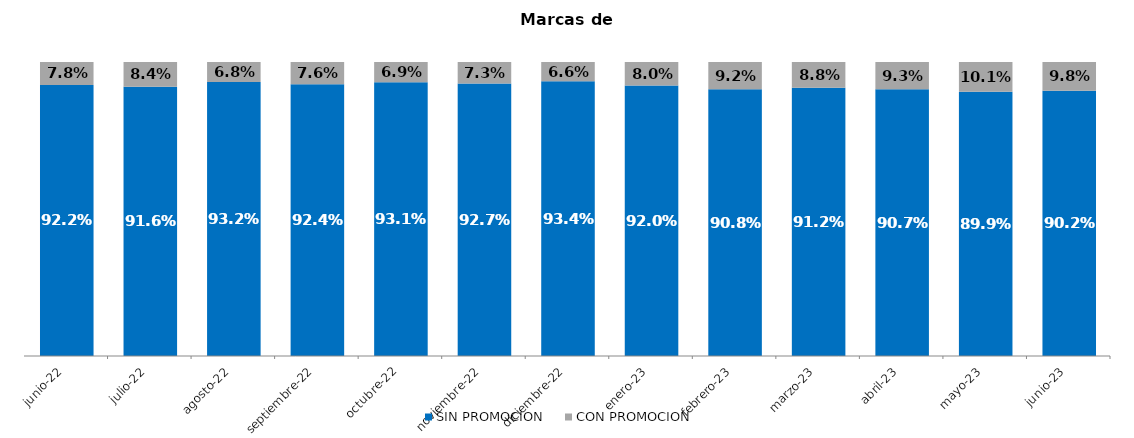
| Category | SIN PROMOCION   | CON PROMOCION   |
|---|---|---|
| 2022-06-01 | 0.922 | 0.078 |
| 2022-07-01 | 0.916 | 0.084 |
| 2022-08-01 | 0.932 | 0.068 |
| 2022-09-01 | 0.924 | 0.076 |
| 2022-10-01 | 0.931 | 0.069 |
| 2022-11-01 | 0.927 | 0.073 |
| 2022-12-01 | 0.934 | 0.066 |
| 2023-01-01 | 0.92 | 0.08 |
| 2023-02-01 | 0.908 | 0.092 |
| 2023-03-01 | 0.912 | 0.088 |
| 2023-04-01 | 0.907 | 0.093 |
| 2023-05-01 | 0.899 | 0.101 |
| 2023-06-01 | 0.902 | 0.098 |